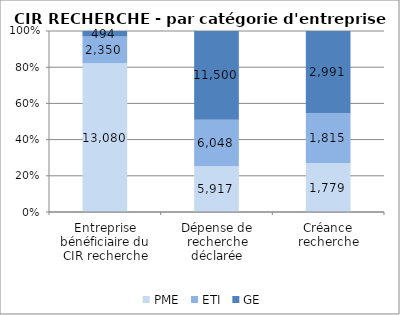
| Category | PME | ETI | GE |
|---|---|---|---|
| Entreprise bénéficiaire du CIR recherche | 13080 | 2350 | 494 |
| Dépense de recherche déclarée | 5916.99 | 6047.52 | 11500.24 |
| Créance recherche | 1779.02 | 1815.23 | 2991.21 |